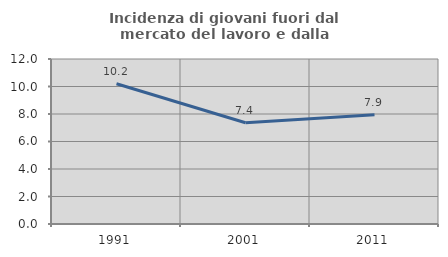
| Category | Incidenza di giovani fuori dal mercato del lavoro e dalla formazione  |
|---|---|
| 1991.0 | 10.204 |
| 2001.0 | 7.364 |
| 2011.0 | 7.95 |